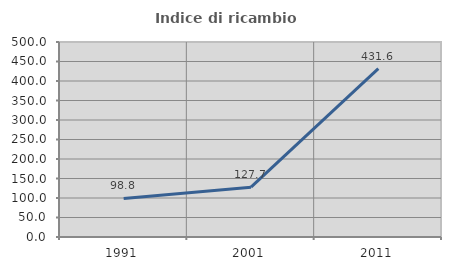
| Category | Indice di ricambio occupazionale  |
|---|---|
| 1991.0 | 98.841 |
| 2001.0 | 127.701 |
| 2011.0 | 431.551 |